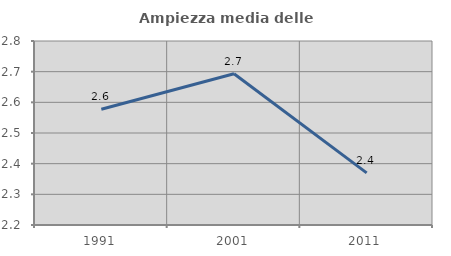
| Category | Ampiezza media delle famiglie |
|---|---|
| 1991.0 | 2.577 |
| 2001.0 | 2.693 |
| 2011.0 | 2.37 |